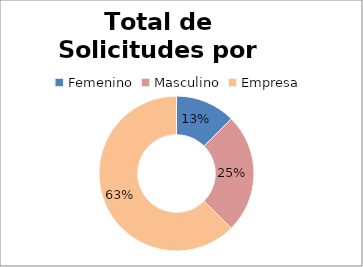
| Category | Series 0 |
|---|---|
| 0 | 1 |
| 1 | 2 |
| 2 | 5 |